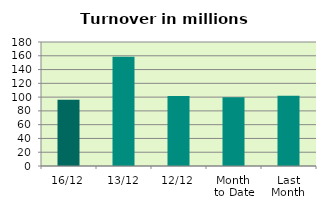
| Category | Series 0 |
|---|---|
| 16/12 | 96.151 |
| 13/12 | 158.435 |
| 12/12 | 101.506 |
| Month 
to Date | 99.761 |
| Last
Month | 101.866 |